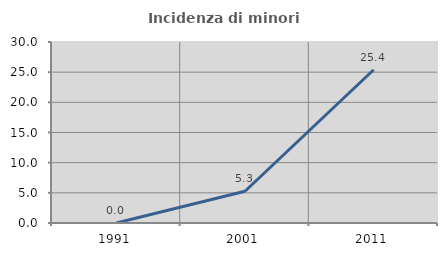
| Category | Incidenza di minori stranieri |
|---|---|
| 1991.0 | 0 |
| 2001.0 | 5.263 |
| 2011.0 | 25.397 |